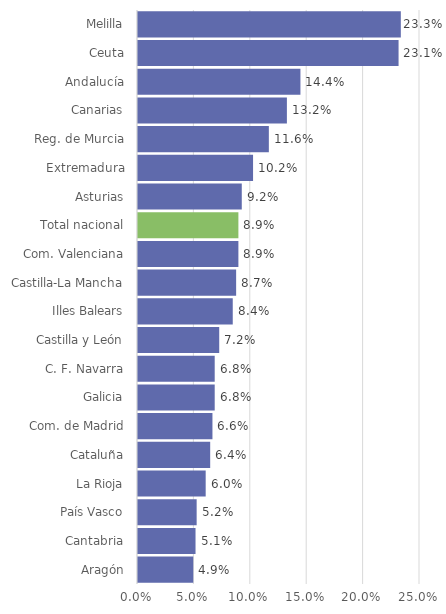
| Category | 2022 |
|---|---|
| Aragón | 0.049 |
| Cantabria | 0.051 |
| País Vasco | 0.052 |
| La Rioja | 0.06 |
| Cataluña | 0.064 |
| Com. de Madrid | 0.066 |
| Galicia | 0.068 |
| C. F. Navarra | 0.068 |
| Castilla y León | 0.072 |
| Illes Balears | 0.084 |
| Castilla-La Mancha | 0.087 |
| Com. Valenciana | 0.089 |
| Total nacional | 0.089 |
| Asturias | 0.092 |
| Extremadura | 0.102 |
| Reg. de Murcia | 0.116 |
| Canarias | 0.132 |
| Andalucía | 0.144 |
| Ceuta | 0.231 |
| Melilla | 0.233 |